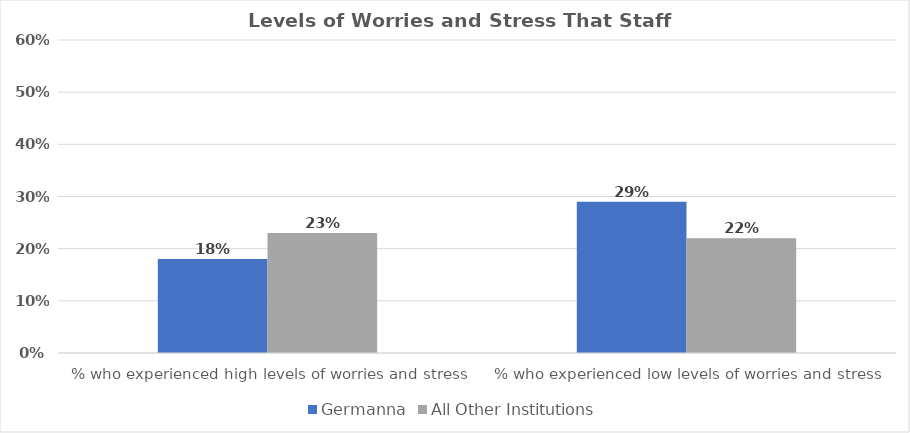
| Category | Germanna | All Other Institutions |
|---|---|---|
| % who experienced high levels of worries and stress | 0.18 | 0.23 |
| % who experienced low levels of worries and stress | 0.29 | 0.22 |